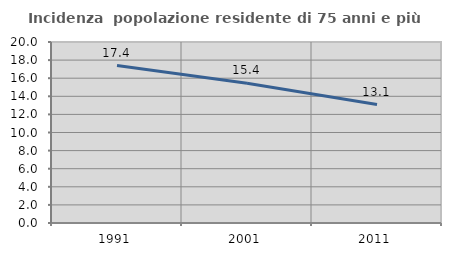
| Category | Incidenza  popolazione residente di 75 anni e più |
|---|---|
| 1991.0 | 17.391 |
| 2001.0 | 15.433 |
| 2011.0 | 13.089 |